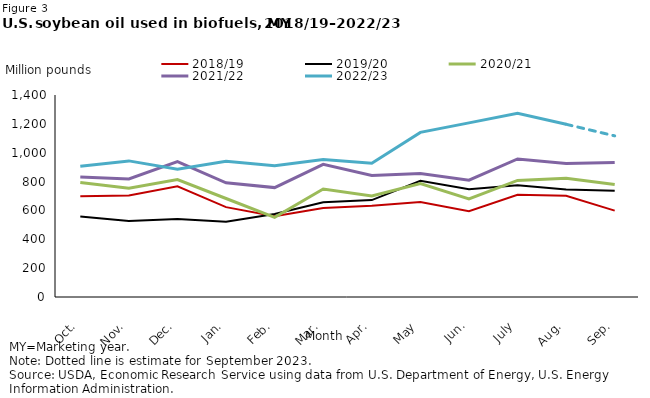
| Category | 2018/19 | 2019/20 | 2020/21 | 2021/22 | 2022/23 |
|---|---|---|---|---|---|
| Oct. | 698.88 | 557.52 | 793.167 | 832.427 | 906.409 |
| Nov. | 703.79 | 526.53 | 753.167 | 818.013 | 943.342 |
| Dec. | 767.76 | 541.05 | 814.167 | 938.341 | 885.659 |
| Jan. | 622.81 | 521 | 682.77 | 791.489 | 940.874 |
| Feb. | 559.57 | 574.78 | 552.509 | 758.131 | 909.987 |
| Mar. | 617.01 | 656.02 | 748.813 | 919.119 | 952.703 |
| Apr. | 631.84 | 671.81 | 699.933 | 842.001 | 926.598 |
| May | 659.05 | 805.35 | 785.914 | 855.746 | 1140.871 |
| Jun. | 594.15 | 747.07 | 679.982 | 809.799 | 1206.92 |
| July | 708.5 | 774.83 | 807.968 | 956.488 | 1272.766 |
| Aug. | 701.14 | 745.33 | 822.948 | 924.718 | 1197.102 |
| Sep. | 598.8 | 736.53 | 779.125 | 932.482 | 1116.769 |